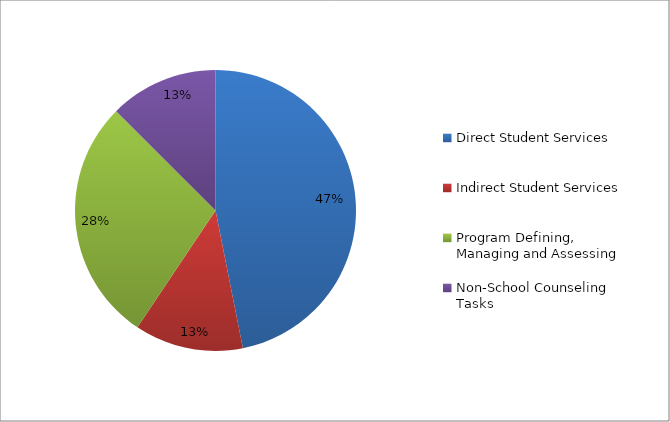
| Category | Series 0 |
|---|---|
| Direct Student Services | 0.469 |
| Indirect Student Services | 0.125 |
| Program Defining, Managing and Assessing | 0.281 |
| Non-School Counseling Tasks | 0.125 |